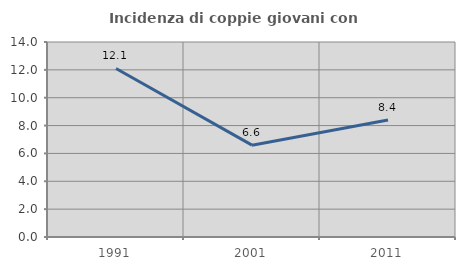
| Category | Incidenza di coppie giovani con figli |
|---|---|
| 1991.0 | 12.1 |
| 2001.0 | 6.593 |
| 2011.0 | 8.397 |